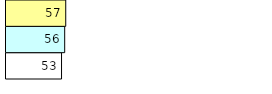
| Category | Total Standouts | Total Recd | Total Tipsters |
|---|---|---|---|
| 0 | 53 | 56 | 57 |